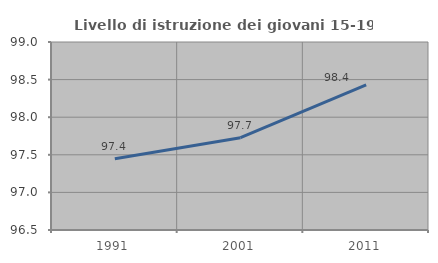
| Category | Livello di istruzione dei giovani 15-19 anni |
|---|---|
| 1991.0 | 97.448 |
| 2001.0 | 97.727 |
| 2011.0 | 98.429 |